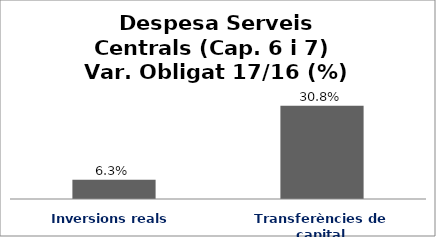
| Category | Series 0 |
|---|---|
| Inversions reals | 0.063 |
| Transferències de capital | 0.308 |